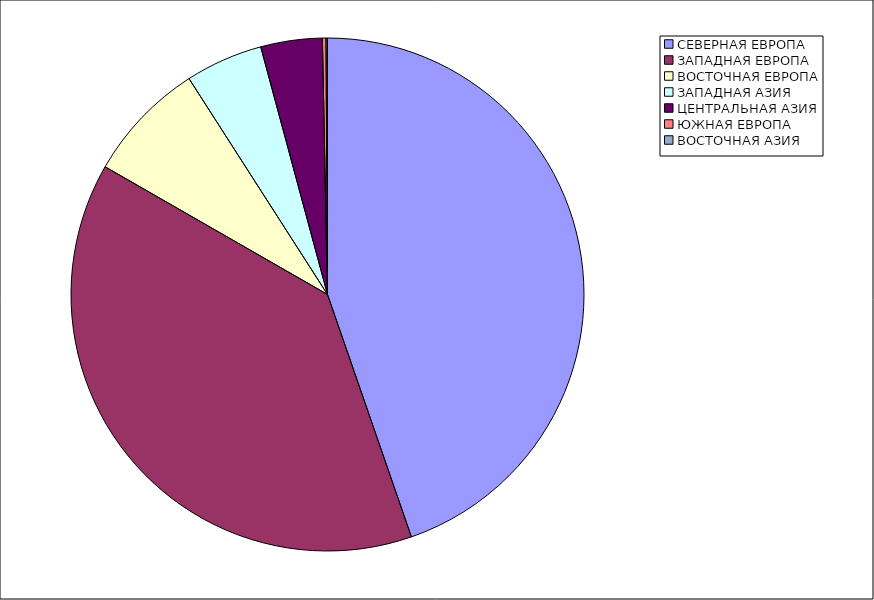
| Category | Оборот |
|---|---|
| СЕВЕРНАЯ ЕВРОПА | 44.695 |
| ЗАПАДНАЯ ЕВРОПА | 38.602 |
| ВОСТОЧНАЯ ЕВРОПА | 7.625 |
| ЗАПАДНАЯ АЗИЯ | 4.885 |
| ЦЕНТРАЛЬНАЯ АЗИЯ | 3.875 |
| ЮЖНАЯ ЕВРОПА | 0.224 |
| ВОСТОЧНАЯ АЗИЯ | 0.094 |